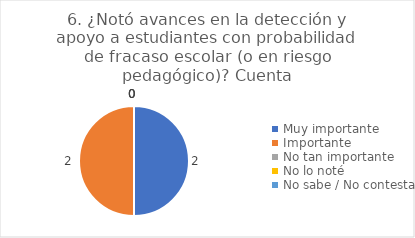
| Category | 6. ¿Notó avances en la detección y apoyo a estudiantes con probabilidad de fracaso escolar (o en riesgo pedagógico)? |
|---|---|
| Muy importante  | 0.5 |
| Importante  | 0.5 |
| No tan importante  | 0 |
| No lo noté  | 0 |
| No sabe / No contesta | 0 |